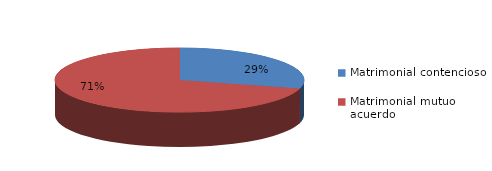
| Category | Series 0 |
|---|---|
| 0 | 61 |
| 1 | 148 |